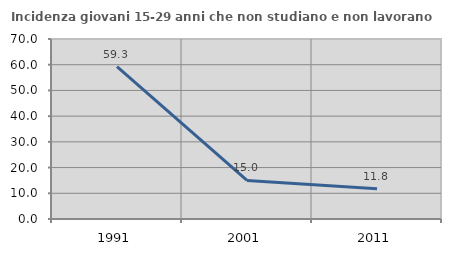
| Category | Incidenza giovani 15-29 anni che non studiano e non lavorano  |
|---|---|
| 1991.0 | 59.3 |
| 2001.0 | 15 |
| 2011.0 | 11.765 |